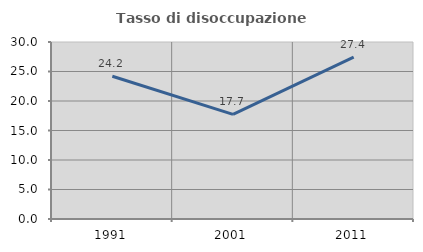
| Category | Tasso di disoccupazione giovanile  |
|---|---|
| 1991.0 | 24.196 |
| 2001.0 | 17.737 |
| 2011.0 | 27.422 |